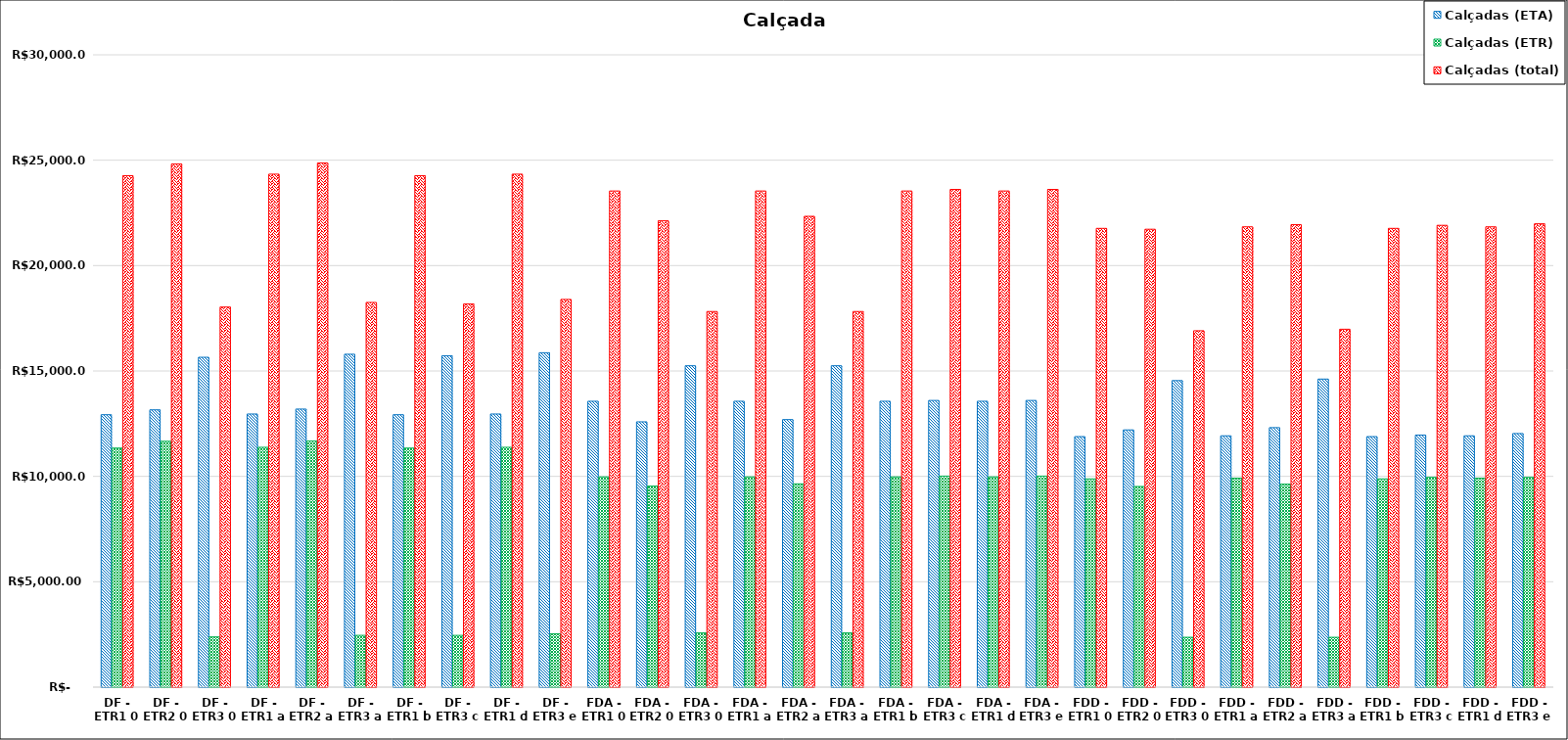
| Category | Calçadas (ETA) | Calçadas (ETR) | Calçadas (total) |
|---|---|---|---|
| DF - ETR1 0 | 12924.07 | 11342.498 | 24266.568 |
| DF - ETR2 0 | 13154.994 | 11663.762 | 24818.756 |
| DF - ETR3 0 | 15649.239 | 2384.023 | 18033.261 |
| DF - ETR1 a | 12957.929 | 11379.653 | 24337.581 |
| DF - ETR2 a | 13192.452 | 11676.314 | 24868.767 |
| DF - ETR3 a | 15793.514 | 2457.281 | 18250.795 |
| DF - ETR1 b | 12924.07 | 11342.498 | 24266.568 |
| DF - ETR3 c | 15721.376 | 2456.16 | 18177.536 |
| DF - ETR1 d | 12957.929 | 11379.653 | 24337.581 |
| DF - ETR3 e | 15865.651 | 2529.419 | 18395.07 |
| FDA - ETR1 0 | 13563.064 | 9975.925 | 23538.988 |
| FDA - ETR2 0 | 12586.734 | 9537.667 | 22124.401 |
| FDA - ETR3 0 | 15246.958 | 2573.595 | 17820.553 |
| FDA - ETR1 a | 13563.064 | 9975.925 | 23538.988 |
| FDA - ETR2 a | 12693.015 | 9644.038 | 22337.053 |
| FDA - ETR3 a | 15246.958 | 2573.595 | 17820.553 |
| FDA - ETR1 b | 13563.064 | 9975.925 | 23538.988 |
| FDA - ETR3 c | 13600.459 | 10013.038 | 23613.497 |
| FDA - ETR1 d | 13563.064 | 9975.925 | 23538.988 |
| FDA - ETR3 e | 13600.459 | 10013.038 | 23613.497 |
| FDD - ETR1 0 | 11885.6 | 9880.29 | 21765.89 |
| FDD - ETR2 0 | 12203.575 | 9520.826 | 21724.4 |
| FDD - ETR3 0 | 14542.193 | 2365.877 | 16908.07 |
| FDD - ETR1 a | 11923.531 | 9914.932 | 21838.463 |
| FDD - ETR2 a | 12311.781 | 9629.032 | 21940.813 |
| FDD - ETR3 a | 14615.936 | 2364.971 | 16980.907 |
| FDD - ETR1 b | 11885.6 | 9880.29 | 21765.89 |
| FDD - ETR3 c | 11957.737 | 9952.428 | 21910.165 |
| FDD - ETR1 d | 11923.531 | 9914.932 | 21838.463 |
| FDD - ETR3 e | 12031.737 | 9951.001 | 21982.738 |